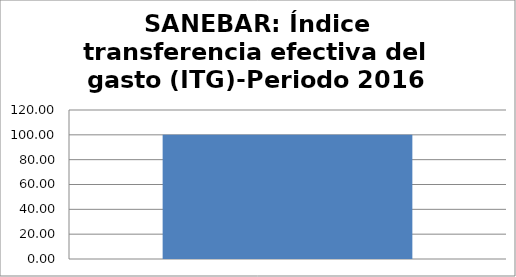
| Category | Índice transferencia efectiva del gasto (ITG) |
|---|---|
| 0 | 100 |